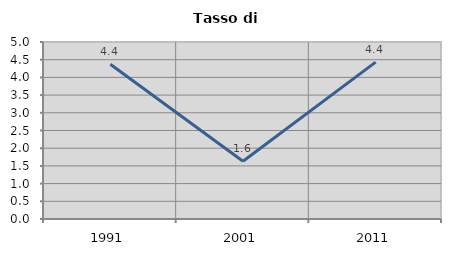
| Category | Tasso di disoccupazione   |
|---|---|
| 1991.0 | 4.373 |
| 2001.0 | 1.633 |
| 2011.0 | 4.43 |